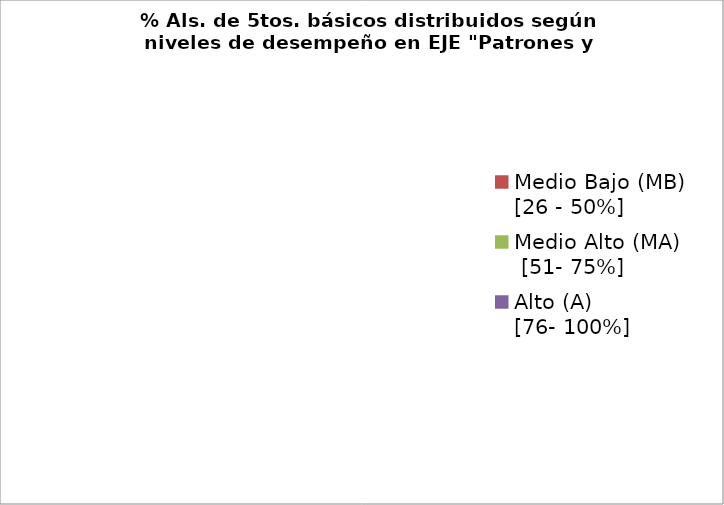
| Category | Series 0 |
|---|---|
| Bajo (B)                  [0 - 25%] | 0 |
| Medio Bajo (MB) [26 - 50%] | 0 |
| Medio Alto (MA)   [51- 75%] | 0 |
| Alto (A)               [76- 100%] | 0 |